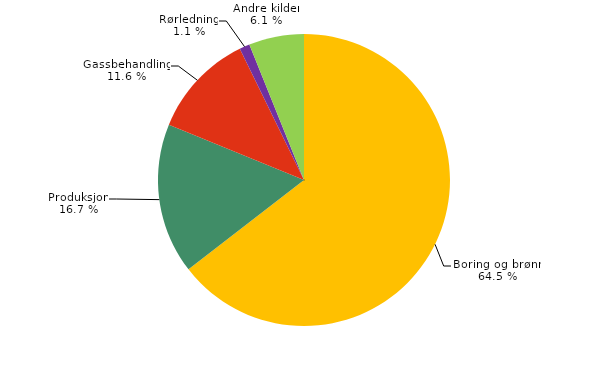
| Category | Series 0 |
|---|---|
| Boring og brønn | 89.5 |
| Produksjon | 23.119 |
| Gassbehandling | 16.045 |
| Rørledning | 1.581 |
| Andre kilder | 8.47 |